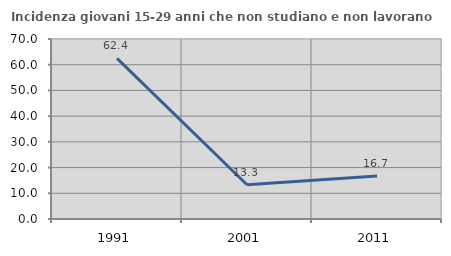
| Category | Incidenza giovani 15-29 anni che non studiano e non lavorano  |
|---|---|
| 1991.0 | 62.439 |
| 2001.0 | 13.333 |
| 2011.0 | 16.703 |